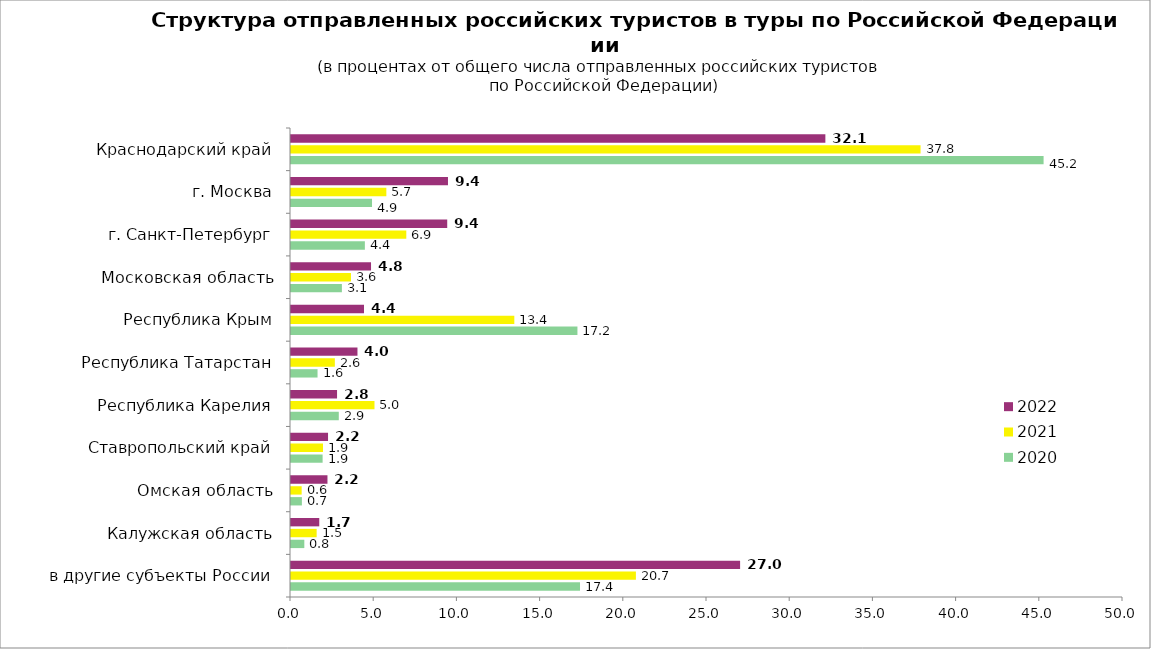
| Category | 2020 | 2021 | 2022 |
|---|---|---|---|
| в другие субъекты России | 17.368 | 20.727 | 26.989 |
| Калужская область | 0.801 | 1.541 | 1.699 |
| Омская область | 0.655 | 0.64 | 2.191 |
| Ставропольский край | 1.9 | 1.923 | 2.226 |
| Республика Карелия | 2.872 | 5.017 | 2.767 |
| Республика Татарстан | 1.595 | 2.634 | 3.994 |
| Республика Крым | 17.214 | 13.42 | 4.387 |
| Московская область | 3.058 | 3.603 | 4.809 |
| г. Санкт-Петербург | 4.439 | 6.929 | 9.388 |
| г. Москва | 4.869 | 5.73 | 9.434 |
| Краснодарский край | 45.228 | 37.834 | 32.113 |